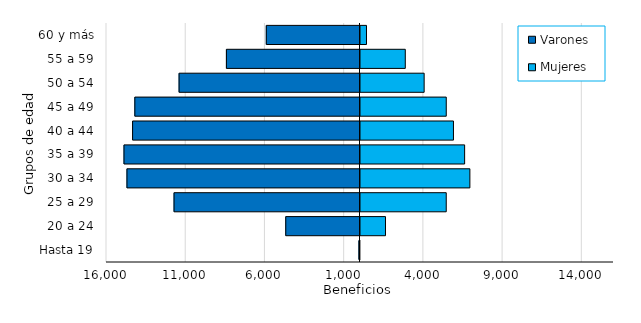
| Category | Varones | Mujeres |
|---|---|---|
| Hasta 19 | -69 | 18 |
| 20 a 24 | -4686 | 1641 |
| 25 a 29 | -11737 | 5475 |
| 30 a 34 | -14709 | 6967 |
| 35 a 39 | -14896 | 6636 |
| 40 a 44 | -14354 | 5930 |
| 45 a 49 | -14212 | 5476 |
| 50 a 54 | -11419 | 4080 |
| 55 a 59 | -8431 | 2890 |
| 60 y más | -5915 | 441 |